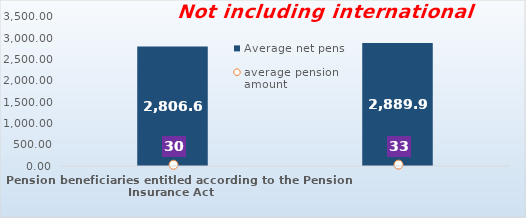
| Category | Average net pension  |
|---|---|
| Pension beneficiaries entitled according to the Pension Insurance Act   | 2806.67 |
| Pension beneficiaries entitled to pension FOR THE FIRST TIME in 2019 according to the Pension Insurance Act  - NEW BENEFICIARIES | 2889.922 |